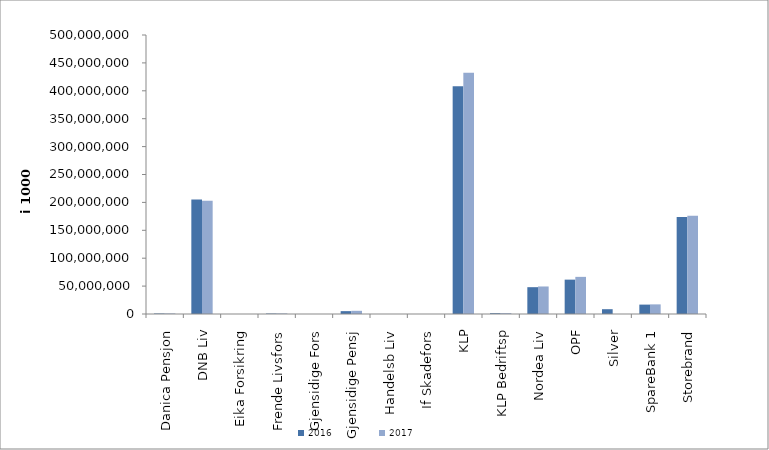
| Category | 2016 | 2017 |
|---|---|---|
| 0 | 910116.415 | 981728.211 |
| 1 | 204999593 | 202823706 |
| 2 | 0 | 0 |
| 3 | 832830 | 979049 |
| 4 | 0 | 0 |
| 5 | 5116874.043 | 5705784 |
| 6 | 28242 | 27134 |
| 7 | 0 | 0 |
| 8 | 408022300.043 | 432230923.249 |
| 9 | 1444299 | 1534741 |
| 10 | 48064765.021 | 49325851.609 |
| 11 | 61571650 | 66551653 |
| 12 | 8612877.074 | 0 |
| 13 | 16839593.388 | 17251701.961 |
| 14 | 173966226.97 | 175952011.514 |